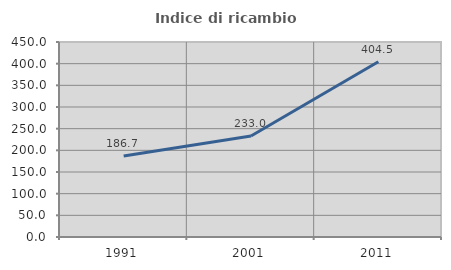
| Category | Indice di ricambio occupazionale  |
|---|---|
| 1991.0 | 186.747 |
| 2001.0 | 232.955 |
| 2011.0 | 404.545 |